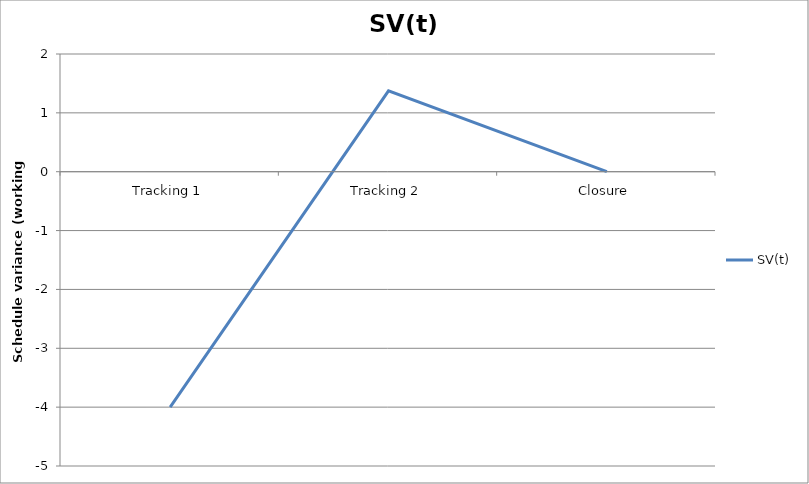
| Category | SV(t) |
|---|---|
| Tracking 1 | -4 |
| Tracking 2 | 1.375 |
| Closure | 0 |